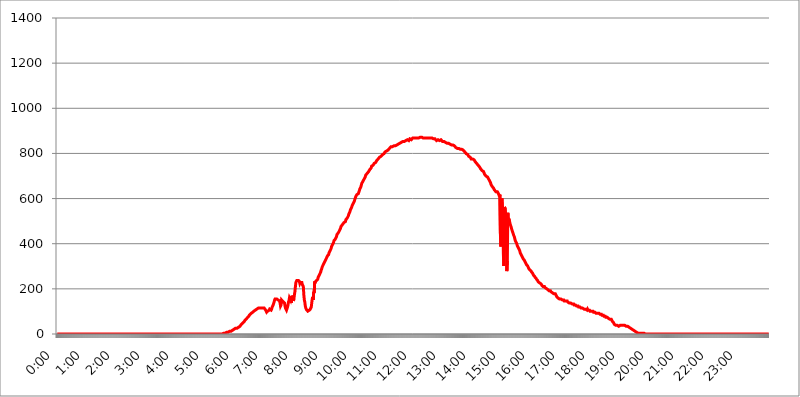
| Category | 2017.08.10. Intenzitás [W/m^2] |
|---|---|
| 0.0 | 0 |
| 0.0006944444444444445 | 0 |
| 0.001388888888888889 | 0 |
| 0.0020833333333333333 | 0 |
| 0.002777777777777778 | 0 |
| 0.003472222222222222 | 0 |
| 0.004166666666666667 | 0 |
| 0.004861111111111111 | 0 |
| 0.005555555555555556 | 0 |
| 0.0062499999999999995 | 0 |
| 0.006944444444444444 | 0 |
| 0.007638888888888889 | 0 |
| 0.008333333333333333 | 0 |
| 0.009027777777777779 | 0 |
| 0.009722222222222222 | 0 |
| 0.010416666666666666 | 0 |
| 0.011111111111111112 | 0 |
| 0.011805555555555555 | 0 |
| 0.012499999999999999 | 0 |
| 0.013194444444444444 | 0 |
| 0.013888888888888888 | 0 |
| 0.014583333333333332 | 0 |
| 0.015277777777777777 | 0 |
| 0.015972222222222224 | 0 |
| 0.016666666666666666 | 0 |
| 0.017361111111111112 | 0 |
| 0.018055555555555557 | 0 |
| 0.01875 | 0 |
| 0.019444444444444445 | 0 |
| 0.02013888888888889 | 0 |
| 0.020833333333333332 | 0 |
| 0.02152777777777778 | 0 |
| 0.022222222222222223 | 0 |
| 0.02291666666666667 | 0 |
| 0.02361111111111111 | 0 |
| 0.024305555555555556 | 0 |
| 0.024999999999999998 | 0 |
| 0.025694444444444447 | 0 |
| 0.02638888888888889 | 0 |
| 0.027083333333333334 | 0 |
| 0.027777777777777776 | 0 |
| 0.02847222222222222 | 0 |
| 0.029166666666666664 | 0 |
| 0.029861111111111113 | 0 |
| 0.030555555555555555 | 0 |
| 0.03125 | 0 |
| 0.03194444444444445 | 0 |
| 0.03263888888888889 | 0 |
| 0.03333333333333333 | 0 |
| 0.034027777777777775 | 0 |
| 0.034722222222222224 | 0 |
| 0.035416666666666666 | 0 |
| 0.036111111111111115 | 0 |
| 0.03680555555555556 | 0 |
| 0.0375 | 0 |
| 0.03819444444444444 | 0 |
| 0.03888888888888889 | 0 |
| 0.03958333333333333 | 0 |
| 0.04027777777777778 | 0 |
| 0.04097222222222222 | 0 |
| 0.041666666666666664 | 0 |
| 0.042361111111111106 | 0 |
| 0.04305555555555556 | 0 |
| 0.043750000000000004 | 0 |
| 0.044444444444444446 | 0 |
| 0.04513888888888889 | 0 |
| 0.04583333333333334 | 0 |
| 0.04652777777777778 | 0 |
| 0.04722222222222222 | 0 |
| 0.04791666666666666 | 0 |
| 0.04861111111111111 | 0 |
| 0.049305555555555554 | 0 |
| 0.049999999999999996 | 0 |
| 0.05069444444444445 | 0 |
| 0.051388888888888894 | 0 |
| 0.052083333333333336 | 0 |
| 0.05277777777777778 | 0 |
| 0.05347222222222222 | 0 |
| 0.05416666666666667 | 0 |
| 0.05486111111111111 | 0 |
| 0.05555555555555555 | 0 |
| 0.05625 | 0 |
| 0.05694444444444444 | 0 |
| 0.057638888888888885 | 0 |
| 0.05833333333333333 | 0 |
| 0.05902777777777778 | 0 |
| 0.059722222222222225 | 0 |
| 0.06041666666666667 | 0 |
| 0.061111111111111116 | 0 |
| 0.06180555555555556 | 0 |
| 0.0625 | 0 |
| 0.06319444444444444 | 0 |
| 0.06388888888888888 | 0 |
| 0.06458333333333334 | 0 |
| 0.06527777777777778 | 0 |
| 0.06597222222222222 | 0 |
| 0.06666666666666667 | 0 |
| 0.06736111111111111 | 0 |
| 0.06805555555555555 | 0 |
| 0.06874999999999999 | 0 |
| 0.06944444444444443 | 0 |
| 0.07013888888888889 | 0 |
| 0.07083333333333333 | 0 |
| 0.07152777777777779 | 0 |
| 0.07222222222222223 | 0 |
| 0.07291666666666667 | 0 |
| 0.07361111111111111 | 0 |
| 0.07430555555555556 | 0 |
| 0.075 | 0 |
| 0.07569444444444444 | 0 |
| 0.0763888888888889 | 0 |
| 0.07708333333333334 | 0 |
| 0.07777777777777778 | 0 |
| 0.07847222222222222 | 0 |
| 0.07916666666666666 | 0 |
| 0.0798611111111111 | 0 |
| 0.08055555555555556 | 0 |
| 0.08125 | 0 |
| 0.08194444444444444 | 0 |
| 0.08263888888888889 | 0 |
| 0.08333333333333333 | 0 |
| 0.08402777777777777 | 0 |
| 0.08472222222222221 | 0 |
| 0.08541666666666665 | 0 |
| 0.08611111111111112 | 0 |
| 0.08680555555555557 | 0 |
| 0.08750000000000001 | 0 |
| 0.08819444444444445 | 0 |
| 0.08888888888888889 | 0 |
| 0.08958333333333333 | 0 |
| 0.09027777777777778 | 0 |
| 0.09097222222222222 | 0 |
| 0.09166666666666667 | 0 |
| 0.09236111111111112 | 0 |
| 0.09305555555555556 | 0 |
| 0.09375 | 0 |
| 0.09444444444444444 | 0 |
| 0.09513888888888888 | 0 |
| 0.09583333333333333 | 0 |
| 0.09652777777777777 | 0 |
| 0.09722222222222222 | 0 |
| 0.09791666666666667 | 0 |
| 0.09861111111111111 | 0 |
| 0.09930555555555555 | 0 |
| 0.09999999999999999 | 0 |
| 0.10069444444444443 | 0 |
| 0.1013888888888889 | 0 |
| 0.10208333333333335 | 0 |
| 0.10277777777777779 | 0 |
| 0.10347222222222223 | 0 |
| 0.10416666666666667 | 0 |
| 0.10486111111111111 | 0 |
| 0.10555555555555556 | 0 |
| 0.10625 | 0 |
| 0.10694444444444444 | 0 |
| 0.1076388888888889 | 0 |
| 0.10833333333333334 | 0 |
| 0.10902777777777778 | 0 |
| 0.10972222222222222 | 0 |
| 0.1111111111111111 | 0 |
| 0.11180555555555556 | 0 |
| 0.11180555555555556 | 0 |
| 0.1125 | 0 |
| 0.11319444444444444 | 0 |
| 0.11388888888888889 | 0 |
| 0.11458333333333333 | 0 |
| 0.11527777777777777 | 0 |
| 0.11597222222222221 | 0 |
| 0.11666666666666665 | 0 |
| 0.1173611111111111 | 0 |
| 0.11805555555555557 | 0 |
| 0.11944444444444445 | 0 |
| 0.12013888888888889 | 0 |
| 0.12083333333333333 | 0 |
| 0.12152777777777778 | 0 |
| 0.12222222222222223 | 0 |
| 0.12291666666666667 | 0 |
| 0.12291666666666667 | 0 |
| 0.12361111111111112 | 0 |
| 0.12430555555555556 | 0 |
| 0.125 | 0 |
| 0.12569444444444444 | 0 |
| 0.12638888888888888 | 0 |
| 0.12708333333333333 | 0 |
| 0.16875 | 0 |
| 0.12847222222222224 | 0 |
| 0.12916666666666668 | 0 |
| 0.12986111111111112 | 0 |
| 0.13055555555555556 | 0 |
| 0.13125 | 0 |
| 0.13194444444444445 | 0 |
| 0.1326388888888889 | 0 |
| 0.13333333333333333 | 0 |
| 0.13402777777777777 | 0 |
| 0.13402777777777777 | 0 |
| 0.13472222222222222 | 0 |
| 0.13541666666666666 | 0 |
| 0.1361111111111111 | 0 |
| 0.13749999999999998 | 0 |
| 0.13819444444444443 | 0 |
| 0.1388888888888889 | 0 |
| 0.13958333333333334 | 0 |
| 0.14027777777777778 | 0 |
| 0.14097222222222222 | 0 |
| 0.14166666666666666 | 0 |
| 0.1423611111111111 | 0 |
| 0.14305555555555557 | 0 |
| 0.14375000000000002 | 0 |
| 0.14444444444444446 | 0 |
| 0.1451388888888889 | 0 |
| 0.1451388888888889 | 0 |
| 0.14652777777777778 | 0 |
| 0.14722222222222223 | 0 |
| 0.14791666666666667 | 0 |
| 0.1486111111111111 | 0 |
| 0.14930555555555555 | 0 |
| 0.15 | 0 |
| 0.15069444444444444 | 0 |
| 0.15138888888888888 | 0 |
| 0.15208333333333332 | 0 |
| 0.15277777777777776 | 0 |
| 0.15347222222222223 | 0 |
| 0.15416666666666667 | 0 |
| 0.15486111111111112 | 0 |
| 0.15555555555555556 | 0 |
| 0.15625 | 0 |
| 0.15694444444444444 | 0 |
| 0.15763888888888888 | 0 |
| 0.15833333333333333 | 0 |
| 0.15902777777777777 | 0 |
| 0.15972222222222224 | 0 |
| 0.16041666666666668 | 0 |
| 0.16111111111111112 | 0 |
| 0.16180555555555556 | 0 |
| 0.1625 | 0 |
| 0.16319444444444445 | 0 |
| 0.1638888888888889 | 0 |
| 0.16458333333333333 | 0 |
| 0.16527777777777777 | 0 |
| 0.16597222222222222 | 0 |
| 0.16666666666666666 | 0 |
| 0.1673611111111111 | 0 |
| 0.16805555555555554 | 0 |
| 0.16874999999999998 | 0 |
| 0.16944444444444443 | 0 |
| 0.17013888888888887 | 0 |
| 0.1708333333333333 | 0 |
| 0.17152777777777775 | 0 |
| 0.17222222222222225 | 0 |
| 0.1729166666666667 | 0 |
| 0.17361111111111113 | 0 |
| 0.17430555555555557 | 0 |
| 0.17500000000000002 | 0 |
| 0.17569444444444446 | 0 |
| 0.1763888888888889 | 0 |
| 0.17708333333333334 | 0 |
| 0.17777777777777778 | 0 |
| 0.17847222222222223 | 0 |
| 0.17916666666666667 | 0 |
| 0.1798611111111111 | 0 |
| 0.18055555555555555 | 0 |
| 0.18125 | 0 |
| 0.18194444444444444 | 0 |
| 0.1826388888888889 | 0 |
| 0.18333333333333335 | 0 |
| 0.1840277777777778 | 0 |
| 0.18472222222222223 | 0 |
| 0.18541666666666667 | 0 |
| 0.18611111111111112 | 0 |
| 0.18680555555555556 | 0 |
| 0.1875 | 0 |
| 0.18819444444444444 | 0 |
| 0.18888888888888888 | 0 |
| 0.18958333333333333 | 0 |
| 0.19027777777777777 | 0 |
| 0.1909722222222222 | 0 |
| 0.19166666666666665 | 0 |
| 0.19236111111111112 | 0 |
| 0.19305555555555554 | 0 |
| 0.19375 | 0 |
| 0.19444444444444445 | 0 |
| 0.1951388888888889 | 0 |
| 0.19583333333333333 | 0 |
| 0.19652777777777777 | 0 |
| 0.19722222222222222 | 0 |
| 0.19791666666666666 | 0 |
| 0.1986111111111111 | 0 |
| 0.19930555555555554 | 0 |
| 0.19999999999999998 | 0 |
| 0.20069444444444443 | 0 |
| 0.20138888888888887 | 0 |
| 0.2020833333333333 | 0 |
| 0.2027777777777778 | 0 |
| 0.2034722222222222 | 0 |
| 0.2041666666666667 | 0 |
| 0.20486111111111113 | 0 |
| 0.20555555555555557 | 0 |
| 0.20625000000000002 | 0 |
| 0.20694444444444446 | 0 |
| 0.2076388888888889 | 0 |
| 0.20833333333333334 | 0 |
| 0.20902777777777778 | 0 |
| 0.20972222222222223 | 0 |
| 0.21041666666666667 | 0 |
| 0.2111111111111111 | 0 |
| 0.21180555555555555 | 0 |
| 0.2125 | 0 |
| 0.21319444444444444 | 0 |
| 0.2138888888888889 | 0 |
| 0.21458333333333335 | 0 |
| 0.2152777777777778 | 0 |
| 0.21597222222222223 | 0 |
| 0.21666666666666667 | 0 |
| 0.21736111111111112 | 0 |
| 0.21805555555555556 | 0 |
| 0.21875 | 0 |
| 0.21944444444444444 | 0 |
| 0.22013888888888888 | 0 |
| 0.22083333333333333 | 0 |
| 0.22152777777777777 | 0 |
| 0.2222222222222222 | 0 |
| 0.22291666666666665 | 0 |
| 0.2236111111111111 | 0 |
| 0.22430555555555556 | 0 |
| 0.225 | 0 |
| 0.22569444444444445 | 0 |
| 0.2263888888888889 | 0 |
| 0.22708333333333333 | 0 |
| 0.22777777777777777 | 0 |
| 0.22847222222222222 | 0 |
| 0.22916666666666666 | 0 |
| 0.2298611111111111 | 0 |
| 0.23055555555555554 | 0 |
| 0.23124999999999998 | 0 |
| 0.23194444444444443 | 3.525 |
| 0.23263888888888887 | 3.525 |
| 0.2333333333333333 | 3.525 |
| 0.2340277777777778 | 3.525 |
| 0.2347222222222222 | 3.525 |
| 0.2354166666666667 | 3.525 |
| 0.23611111111111113 | 3.525 |
| 0.23680555555555557 | 3.525 |
| 0.23750000000000002 | 7.887 |
| 0.23819444444444446 | 7.887 |
| 0.2388888888888889 | 7.887 |
| 0.23958333333333334 | 7.887 |
| 0.24027777777777778 | 7.887 |
| 0.24097222222222223 | 12.257 |
| 0.24166666666666667 | 12.257 |
| 0.2423611111111111 | 12.257 |
| 0.24305555555555555 | 12.257 |
| 0.24375 | 12.257 |
| 0.24444444444444446 | 16.636 |
| 0.24513888888888888 | 16.636 |
| 0.24583333333333335 | 16.636 |
| 0.2465277777777778 | 21.024 |
| 0.24722222222222223 | 21.024 |
| 0.24791666666666667 | 21.024 |
| 0.24861111111111112 | 21.024 |
| 0.24930555555555556 | 21.024 |
| 0.25 | 25.419 |
| 0.25069444444444444 | 25.419 |
| 0.2513888888888889 | 25.419 |
| 0.2520833333333333 | 25.419 |
| 0.25277777777777777 | 29.823 |
| 0.2534722222222222 | 29.823 |
| 0.25416666666666665 | 29.823 |
| 0.2548611111111111 | 34.234 |
| 0.2555555555555556 | 34.234 |
| 0.25625000000000003 | 34.234 |
| 0.2569444444444445 | 38.653 |
| 0.2576388888888889 | 38.653 |
| 0.25833333333333336 | 43.079 |
| 0.2590277777777778 | 43.079 |
| 0.25972222222222224 | 47.511 |
| 0.2604166666666667 | 47.511 |
| 0.2611111111111111 | 51.951 |
| 0.26180555555555557 | 51.951 |
| 0.2625 | 56.398 |
| 0.26319444444444445 | 60.85 |
| 0.2638888888888889 | 60.85 |
| 0.26458333333333334 | 65.31 |
| 0.2652777777777778 | 65.31 |
| 0.2659722222222222 | 69.775 |
| 0.26666666666666666 | 69.775 |
| 0.2673611111111111 | 74.246 |
| 0.26805555555555555 | 74.246 |
| 0.26875 | 78.722 |
| 0.26944444444444443 | 83.205 |
| 0.2701388888888889 | 83.205 |
| 0.2708333333333333 | 87.692 |
| 0.27152777777777776 | 87.692 |
| 0.2722222222222222 | 92.184 |
| 0.27291666666666664 | 92.184 |
| 0.2736111111111111 | 92.184 |
| 0.2743055555555555 | 96.682 |
| 0.27499999999999997 | 96.682 |
| 0.27569444444444446 | 101.184 |
| 0.27638888888888885 | 101.184 |
| 0.27708333333333335 | 101.184 |
| 0.2777777777777778 | 105.69 |
| 0.27847222222222223 | 105.69 |
| 0.2791666666666667 | 105.69 |
| 0.2798611111111111 | 110.201 |
| 0.28055555555555556 | 110.201 |
| 0.28125 | 110.201 |
| 0.28194444444444444 | 114.716 |
| 0.2826388888888889 | 114.716 |
| 0.2833333333333333 | 114.716 |
| 0.28402777777777777 | 114.716 |
| 0.2847222222222222 | 114.716 |
| 0.28541666666666665 | 114.716 |
| 0.28611111111111115 | 114.716 |
| 0.28680555555555554 | 114.716 |
| 0.28750000000000003 | 114.716 |
| 0.2881944444444445 | 114.716 |
| 0.2888888888888889 | 114.716 |
| 0.28958333333333336 | 114.716 |
| 0.2902777777777778 | 114.716 |
| 0.29097222222222224 | 114.716 |
| 0.2916666666666667 | 114.716 |
| 0.2923611111111111 | 105.69 |
| 0.29305555555555557 | 101.184 |
| 0.29375 | 96.682 |
| 0.29444444444444445 | 96.682 |
| 0.2951388888888889 | 101.184 |
| 0.29583333333333334 | 101.184 |
| 0.2965277777777778 | 101.184 |
| 0.2972222222222222 | 105.69 |
| 0.29791666666666666 | 110.201 |
| 0.2986111111111111 | 110.201 |
| 0.29930555555555555 | 110.201 |
| 0.3 | 105.69 |
| 0.30069444444444443 | 110.201 |
| 0.3013888888888889 | 119.235 |
| 0.3020833333333333 | 119.235 |
| 0.30277777777777776 | 128.284 |
| 0.3034722222222222 | 128.284 |
| 0.30416666666666664 | 141.884 |
| 0.3048611111111111 | 150.964 |
| 0.3055555555555555 | 155.509 |
| 0.30624999999999997 | 155.509 |
| 0.3069444444444444 | 155.509 |
| 0.3076388888888889 | 155.509 |
| 0.30833333333333335 | 155.509 |
| 0.3090277777777778 | 155.509 |
| 0.30972222222222223 | 150.964 |
| 0.3104166666666667 | 150.964 |
| 0.3111111111111111 | 150.964 |
| 0.31180555555555556 | 146.423 |
| 0.3125 | 137.347 |
| 0.31319444444444444 | 123.758 |
| 0.3138888888888889 | 128.284 |
| 0.3145833333333333 | 150.964 |
| 0.31527777777777777 | 150.964 |
| 0.3159722222222222 | 146.423 |
| 0.31666666666666665 | 146.423 |
| 0.31736111111111115 | 141.884 |
| 0.31805555555555554 | 141.884 |
| 0.31875000000000003 | 137.347 |
| 0.3194444444444445 | 123.758 |
| 0.3201388888888889 | 114.716 |
| 0.32083333333333336 | 110.201 |
| 0.3215277777777778 | 105.69 |
| 0.32222222222222224 | 105.69 |
| 0.3229166666666667 | 119.235 |
| 0.3236111111111111 | 128.284 |
| 0.32430555555555557 | 141.884 |
| 0.325 | 146.423 |
| 0.32569444444444445 | 160.056 |
| 0.3263888888888889 | 155.509 |
| 0.32708333333333334 | 150.964 |
| 0.3277777777777778 | 164.605 |
| 0.3284722222222222 | 137.347 |
| 0.32916666666666666 | 169.156 |
| 0.3298611111111111 | 155.509 |
| 0.33055555555555555 | 169.156 |
| 0.33125 | 146.423 |
| 0.33194444444444443 | 155.509 |
| 0.3326388888888889 | 173.709 |
| 0.3333333333333333 | 187.378 |
| 0.3340277777777778 | 210.182 |
| 0.3347222222222222 | 228.436 |
| 0.3354166666666667 | 228.436 |
| 0.3361111111111111 | 237.564 |
| 0.3368055555555556 | 237.564 |
| 0.33749999999999997 | 237.564 |
| 0.33819444444444446 | 237.564 |
| 0.33888888888888885 | 237.564 |
| 0.33958333333333335 | 233 |
| 0.34027777777777773 | 223.873 |
| 0.34097222222222223 | 228.436 |
| 0.3416666666666666 | 228.436 |
| 0.3423611111111111 | 228.436 |
| 0.3430555555555555 | 228.436 |
| 0.34375 | 219.309 |
| 0.3444444444444445 | 214.746 |
| 0.3451388888888889 | 210.182 |
| 0.3458333333333334 | 173.709 |
| 0.34652777777777777 | 150.964 |
| 0.34722222222222227 | 141.884 |
| 0.34791666666666665 | 123.758 |
| 0.34861111111111115 | 114.716 |
| 0.34930555555555554 | 110.201 |
| 0.35000000000000003 | 105.69 |
| 0.3506944444444444 | 105.69 |
| 0.3513888888888889 | 101.184 |
| 0.3520833333333333 | 101.184 |
| 0.3527777777777778 | 101.184 |
| 0.3534722222222222 | 105.69 |
| 0.3541666666666667 | 105.69 |
| 0.3548611111111111 | 110.201 |
| 0.35555555555555557 | 114.716 |
| 0.35625 | 119.235 |
| 0.35694444444444445 | 119.235 |
| 0.3576388888888889 | 155.509 |
| 0.35833333333333334 | 164.605 |
| 0.3590277777777778 | 150.964 |
| 0.3597222222222222 | 187.378 |
| 0.36041666666666666 | 182.82 |
| 0.3611111111111111 | 233 |
| 0.36180555555555555 | 228.436 |
| 0.3625 | 233 |
| 0.36319444444444443 | 233 |
| 0.3638888888888889 | 237.564 |
| 0.3645833333333333 | 237.564 |
| 0.3652777777777778 | 242.127 |
| 0.3659722222222222 | 251.251 |
| 0.3666666666666667 | 255.813 |
| 0.3673611111111111 | 260.373 |
| 0.3680555555555556 | 264.932 |
| 0.36874999999999997 | 269.49 |
| 0.36944444444444446 | 274.047 |
| 0.37013888888888885 | 283.156 |
| 0.37083333333333335 | 287.709 |
| 0.37152777777777773 | 296.808 |
| 0.37222222222222223 | 301.354 |
| 0.3729166666666666 | 305.898 |
| 0.3736111111111111 | 305.898 |
| 0.3743055555555555 | 314.98 |
| 0.375 | 319.517 |
| 0.3756944444444445 | 324.052 |
| 0.3763888888888889 | 328.584 |
| 0.3770833333333334 | 333.113 |
| 0.37777777777777777 | 337.639 |
| 0.37847222222222227 | 342.162 |
| 0.37916666666666665 | 346.682 |
| 0.37986111111111115 | 346.682 |
| 0.38055555555555554 | 351.198 |
| 0.38125000000000003 | 360.221 |
| 0.3819444444444444 | 360.221 |
| 0.3826388888888889 | 369.23 |
| 0.3833333333333333 | 373.729 |
| 0.3840277777777778 | 378.224 |
| 0.3847222222222222 | 387.202 |
| 0.3854166666666667 | 387.202 |
| 0.3861111111111111 | 396.164 |
| 0.38680555555555557 | 400.638 |
| 0.3875 | 405.108 |
| 0.38819444444444445 | 414.035 |
| 0.3888888888888889 | 414.035 |
| 0.38958333333333334 | 418.492 |
| 0.3902777777777778 | 422.943 |
| 0.3909722222222222 | 427.39 |
| 0.39166666666666666 | 431.833 |
| 0.3923611111111111 | 440.702 |
| 0.39305555555555555 | 445.129 |
| 0.39375 | 445.129 |
| 0.39444444444444443 | 449.551 |
| 0.3951388888888889 | 453.968 |
| 0.3958333333333333 | 458.38 |
| 0.3965277777777778 | 462.786 |
| 0.3972222222222222 | 467.187 |
| 0.3979166666666667 | 475.972 |
| 0.3986111111111111 | 475.972 |
| 0.3993055555555556 | 480.356 |
| 0.39999999999999997 | 484.735 |
| 0.40069444444444446 | 489.108 |
| 0.40138888888888885 | 489.108 |
| 0.40208333333333335 | 493.475 |
| 0.40277777777777773 | 493.475 |
| 0.40347222222222223 | 497.836 |
| 0.4041666666666666 | 497.836 |
| 0.4048611111111111 | 506.542 |
| 0.4055555555555555 | 506.542 |
| 0.40625 | 510.885 |
| 0.4069444444444445 | 515.223 |
| 0.4076388888888889 | 519.555 |
| 0.4083333333333334 | 523.88 |
| 0.40902777777777777 | 532.513 |
| 0.40972222222222227 | 536.82 |
| 0.41041666666666665 | 541.121 |
| 0.41111111111111115 | 549.704 |
| 0.41180555555555554 | 553.986 |
| 0.41250000000000003 | 558.261 |
| 0.4131944444444444 | 562.53 |
| 0.4138888888888889 | 571.049 |
| 0.4145833333333333 | 575.299 |
| 0.4152777777777778 | 579.542 |
| 0.4159722222222222 | 583.779 |
| 0.4166666666666667 | 588.009 |
| 0.4173611111111111 | 596.45 |
| 0.41805555555555557 | 600.661 |
| 0.41875 | 609.062 |
| 0.41944444444444445 | 613.252 |
| 0.4201388888888889 | 617.436 |
| 0.42083333333333334 | 621.613 |
| 0.4215277777777778 | 621.613 |
| 0.4222222222222222 | 621.613 |
| 0.42291666666666666 | 625.784 |
| 0.4236111111111111 | 634.105 |
| 0.42430555555555555 | 642.4 |
| 0.425 | 646.537 |
| 0.42569444444444443 | 650.667 |
| 0.4263888888888889 | 658.909 |
| 0.4270833333333333 | 667.123 |
| 0.4277777777777778 | 667.123 |
| 0.4284722222222222 | 671.22 |
| 0.4291666666666667 | 679.395 |
| 0.4298611111111111 | 683.473 |
| 0.4305555555555556 | 687.544 |
| 0.43124999999999997 | 691.608 |
| 0.43194444444444446 | 695.666 |
| 0.43263888888888885 | 703.762 |
| 0.43333333333333335 | 703.762 |
| 0.43402777777777773 | 707.8 |
| 0.43472222222222223 | 711.832 |
| 0.4354166666666666 | 711.832 |
| 0.4361111111111111 | 711.832 |
| 0.4368055555555555 | 719.877 |
| 0.4375 | 723.889 |
| 0.4381944444444445 | 727.896 |
| 0.4388888888888889 | 727.896 |
| 0.4395833333333334 | 727.896 |
| 0.44027777777777777 | 735.89 |
| 0.44097222222222227 | 743.859 |
| 0.44166666666666665 | 743.859 |
| 0.44236111111111115 | 747.834 |
| 0.44305555555555554 | 747.834 |
| 0.44375000000000003 | 751.803 |
| 0.4444444444444444 | 755.766 |
| 0.4451388888888889 | 759.723 |
| 0.4458333333333333 | 755.766 |
| 0.4465277777777778 | 759.723 |
| 0.4472222222222222 | 763.674 |
| 0.4479166666666667 | 767.62 |
| 0.4486111111111111 | 771.559 |
| 0.44930555555555557 | 771.559 |
| 0.45 | 775.492 |
| 0.45069444444444445 | 775.492 |
| 0.4513888888888889 | 779.42 |
| 0.45208333333333334 | 783.342 |
| 0.4527777777777778 | 783.342 |
| 0.4534722222222222 | 787.258 |
| 0.45416666666666666 | 787.258 |
| 0.4548611111111111 | 791.169 |
| 0.45555555555555555 | 791.169 |
| 0.45625 | 795.074 |
| 0.45694444444444443 | 798.974 |
| 0.4576388888888889 | 798.974 |
| 0.4583333333333333 | 798.974 |
| 0.4590277777777778 | 802.868 |
| 0.4597222222222222 | 806.757 |
| 0.4604166666666667 | 810.641 |
| 0.4611111111111111 | 806.757 |
| 0.4618055555555556 | 810.641 |
| 0.46249999999999997 | 810.641 |
| 0.46319444444444446 | 810.641 |
| 0.46388888888888885 | 814.519 |
| 0.46458333333333335 | 814.519 |
| 0.46527777777777773 | 818.392 |
| 0.46597222222222223 | 822.26 |
| 0.4666666666666666 | 822.26 |
| 0.4673611111111111 | 826.123 |
| 0.4680555555555555 | 829.981 |
| 0.46875 | 829.981 |
| 0.4694444444444445 | 833.834 |
| 0.4701388888888889 | 829.981 |
| 0.4708333333333334 | 829.981 |
| 0.47152777777777777 | 833.834 |
| 0.47222222222222227 | 833.834 |
| 0.47291666666666665 | 833.834 |
| 0.47361111111111115 | 833.834 |
| 0.47430555555555554 | 833.834 |
| 0.47500000000000003 | 837.682 |
| 0.4756944444444444 | 833.834 |
| 0.4763888888888889 | 837.682 |
| 0.4770833333333333 | 841.526 |
| 0.4777777777777778 | 841.526 |
| 0.4784722222222222 | 841.526 |
| 0.4791666666666667 | 845.365 |
| 0.4798611111111111 | 841.526 |
| 0.48055555555555557 | 845.365 |
| 0.48125 | 845.365 |
| 0.48194444444444445 | 849.199 |
| 0.4826388888888889 | 849.199 |
| 0.48333333333333334 | 853.029 |
| 0.4840277777777778 | 853.029 |
| 0.4847222222222222 | 853.029 |
| 0.48541666666666666 | 853.029 |
| 0.4861111111111111 | 853.029 |
| 0.48680555555555555 | 853.029 |
| 0.4875 | 853.029 |
| 0.48819444444444443 | 856.855 |
| 0.4888888888888889 | 856.855 |
| 0.4895833333333333 | 856.855 |
| 0.4902777777777778 | 860.676 |
| 0.4909722222222222 | 860.676 |
| 0.4916666666666667 | 860.676 |
| 0.4923611111111111 | 856.855 |
| 0.4930555555555556 | 856.855 |
| 0.49374999999999997 | 860.676 |
| 0.49444444444444446 | 864.493 |
| 0.49513888888888885 | 864.493 |
| 0.49583333333333335 | 860.676 |
| 0.49652777777777773 | 860.676 |
| 0.49722222222222223 | 864.493 |
| 0.4979166666666666 | 864.493 |
| 0.4986111111111111 | 868.305 |
| 0.4993055555555555 | 868.305 |
| 0.5 | 868.305 |
| 0.5006944444444444 | 868.305 |
| 0.5013888888888889 | 868.305 |
| 0.5020833333333333 | 868.305 |
| 0.5027777777777778 | 868.305 |
| 0.5034722222222222 | 864.493 |
| 0.5041666666666667 | 868.305 |
| 0.5048611111111111 | 868.305 |
| 0.5055555555555555 | 868.305 |
| 0.50625 | 868.305 |
| 0.5069444444444444 | 868.305 |
| 0.5076388888888889 | 868.305 |
| 0.5083333333333333 | 868.305 |
| 0.5090277777777777 | 872.114 |
| 0.5097222222222222 | 872.114 |
| 0.5104166666666666 | 868.305 |
| 0.5111111111111112 | 872.114 |
| 0.5118055555555555 | 868.305 |
| 0.5125000000000001 | 868.305 |
| 0.5131944444444444 | 868.305 |
| 0.513888888888889 | 868.305 |
| 0.5145833333333333 | 864.493 |
| 0.5152777777777778 | 868.305 |
| 0.5159722222222222 | 868.305 |
| 0.5166666666666667 | 868.305 |
| 0.517361111111111 | 868.305 |
| 0.5180555555555556 | 868.305 |
| 0.5187499999999999 | 864.493 |
| 0.5194444444444445 | 868.305 |
| 0.5201388888888888 | 868.305 |
| 0.5208333333333334 | 868.305 |
| 0.5215277777777778 | 868.305 |
| 0.5222222222222223 | 868.305 |
| 0.5229166666666667 | 868.305 |
| 0.5236111111111111 | 868.305 |
| 0.5243055555555556 | 868.305 |
| 0.525 | 868.305 |
| 0.5256944444444445 | 868.305 |
| 0.5263888888888889 | 868.305 |
| 0.5270833333333333 | 868.305 |
| 0.5277777777777778 | 864.493 |
| 0.5284722222222222 | 868.305 |
| 0.5291666666666667 | 868.305 |
| 0.5298611111111111 | 864.493 |
| 0.5305555555555556 | 860.676 |
| 0.53125 | 860.676 |
| 0.5319444444444444 | 856.855 |
| 0.5326388888888889 | 860.676 |
| 0.5333333333333333 | 860.676 |
| 0.5340277777777778 | 860.676 |
| 0.5347222222222222 | 860.676 |
| 0.5354166666666667 | 856.855 |
| 0.5361111111111111 | 856.855 |
| 0.5368055555555555 | 860.676 |
| 0.5375 | 860.676 |
| 0.5381944444444444 | 860.676 |
| 0.5388888888888889 | 856.855 |
| 0.5395833333333333 | 856.855 |
| 0.5402777777777777 | 853.029 |
| 0.5409722222222222 | 853.029 |
| 0.5416666666666666 | 853.029 |
| 0.5423611111111112 | 853.029 |
| 0.5430555555555555 | 853.029 |
| 0.5437500000000001 | 849.199 |
| 0.5444444444444444 | 849.199 |
| 0.545138888888889 | 845.365 |
| 0.5458333333333333 | 845.365 |
| 0.5465277777777778 | 845.365 |
| 0.5472222222222222 | 845.365 |
| 0.5479166666666667 | 845.365 |
| 0.548611111111111 | 845.365 |
| 0.5493055555555556 | 841.526 |
| 0.5499999999999999 | 841.526 |
| 0.5506944444444445 | 841.526 |
| 0.5513888888888888 | 837.682 |
| 0.5520833333333334 | 837.682 |
| 0.5527777777777778 | 837.682 |
| 0.5534722222222223 | 837.682 |
| 0.5541666666666667 | 837.682 |
| 0.5548611111111111 | 837.682 |
| 0.5555555555555556 | 833.834 |
| 0.55625 | 833.834 |
| 0.5569444444444445 | 833.834 |
| 0.5576388888888889 | 829.981 |
| 0.5583333333333333 | 833.834 |
| 0.5590277777777778 | 826.123 |
| 0.5597222222222222 | 826.123 |
| 0.5604166666666667 | 826.123 |
| 0.5611111111111111 | 822.26 |
| 0.5618055555555556 | 822.26 |
| 0.5625 | 822.26 |
| 0.5631944444444444 | 822.26 |
| 0.5638888888888889 | 822.26 |
| 0.5645833333333333 | 818.392 |
| 0.5652777777777778 | 818.392 |
| 0.5659722222222222 | 818.392 |
| 0.5666666666666667 | 818.392 |
| 0.5673611111111111 | 818.392 |
| 0.5680555555555555 | 818.392 |
| 0.56875 | 818.392 |
| 0.5694444444444444 | 814.519 |
| 0.5701388888888889 | 814.519 |
| 0.5708333333333333 | 810.641 |
| 0.5715277777777777 | 806.757 |
| 0.5722222222222222 | 802.868 |
| 0.5729166666666666 | 802.868 |
| 0.5736111111111112 | 798.974 |
| 0.5743055555555555 | 798.974 |
| 0.5750000000000001 | 798.974 |
| 0.5756944444444444 | 795.074 |
| 0.576388888888889 | 791.169 |
| 0.5770833333333333 | 787.258 |
| 0.5777777777777778 | 791.169 |
| 0.5784722222222222 | 787.258 |
| 0.5791666666666667 | 783.342 |
| 0.579861111111111 | 779.42 |
| 0.5805555555555556 | 775.492 |
| 0.5812499999999999 | 779.42 |
| 0.5819444444444445 | 775.492 |
| 0.5826388888888888 | 775.492 |
| 0.5833333333333334 | 775.492 |
| 0.5840277777777778 | 771.559 |
| 0.5847222222222223 | 771.559 |
| 0.5854166666666667 | 767.62 |
| 0.5861111111111111 | 763.674 |
| 0.5868055555555556 | 763.674 |
| 0.5875 | 759.723 |
| 0.5881944444444445 | 755.766 |
| 0.5888888888888889 | 751.803 |
| 0.5895833333333333 | 751.803 |
| 0.5902777777777778 | 747.834 |
| 0.5909722222222222 | 743.859 |
| 0.5916666666666667 | 743.859 |
| 0.5923611111111111 | 739.877 |
| 0.5930555555555556 | 735.89 |
| 0.59375 | 731.896 |
| 0.5944444444444444 | 731.896 |
| 0.5951388888888889 | 727.896 |
| 0.5958333333333333 | 723.889 |
| 0.5965277777777778 | 723.889 |
| 0.5972222222222222 | 719.877 |
| 0.5979166666666667 | 719.877 |
| 0.5986111111111111 | 715.858 |
| 0.5993055555555555 | 707.8 |
| 0.6 | 707.8 |
| 0.6006944444444444 | 703.762 |
| 0.6013888888888889 | 699.717 |
| 0.6020833333333333 | 699.717 |
| 0.6027777777777777 | 695.666 |
| 0.6034722222222222 | 695.666 |
| 0.6041666666666666 | 691.608 |
| 0.6048611111111112 | 687.544 |
| 0.6055555555555555 | 683.473 |
| 0.6062500000000001 | 679.395 |
| 0.6069444444444444 | 675.311 |
| 0.607638888888889 | 671.22 |
| 0.6083333333333333 | 663.019 |
| 0.6090277777777778 | 658.909 |
| 0.6097222222222222 | 654.791 |
| 0.6104166666666667 | 650.667 |
| 0.611111111111111 | 650.667 |
| 0.6118055555555556 | 646.537 |
| 0.6124999999999999 | 642.4 |
| 0.6131944444444445 | 638.256 |
| 0.6138888888888888 | 638.256 |
| 0.6145833333333334 | 634.105 |
| 0.6152777777777778 | 629.948 |
| 0.6159722222222223 | 629.948 |
| 0.6166666666666667 | 629.948 |
| 0.6173611111111111 | 629.948 |
| 0.6180555555555556 | 625.784 |
| 0.61875 | 625.784 |
| 0.6194444444444445 | 617.436 |
| 0.6201388888888889 | 609.062 |
| 0.6208333333333333 | 617.436 |
| 0.6215277777777778 | 445.129 |
| 0.6222222222222222 | 387.202 |
| 0.6229166666666667 | 566.793 |
| 0.6236111111111111 | 600.661 |
| 0.6243055555555556 | 596.45 |
| 0.625 | 532.513 |
| 0.6256944444444444 | 355.712 |
| 0.6263888888888889 | 301.354 |
| 0.6270833333333333 | 562.53 |
| 0.6277777777777778 | 562.53 |
| 0.6284722222222222 | 553.986 |
| 0.6291666666666667 | 558.261 |
| 0.6298611111111111 | 449.551 |
| 0.6305555555555555 | 278.603 |
| 0.63125 | 324.052 |
| 0.6319444444444444 | 536.82 |
| 0.6326388888888889 | 502.192 |
| 0.6333333333333333 | 510.885 |
| 0.6340277777777777 | 506.542 |
| 0.6347222222222222 | 493.475 |
| 0.6354166666666666 | 484.735 |
| 0.6361111111111112 | 480.356 |
| 0.6368055555555555 | 471.582 |
| 0.6375000000000001 | 462.786 |
| 0.6381944444444444 | 458.38 |
| 0.638888888888889 | 449.551 |
| 0.6395833333333333 | 445.129 |
| 0.6402777777777778 | 436.27 |
| 0.6409722222222222 | 431.833 |
| 0.6416666666666667 | 422.943 |
| 0.642361111111111 | 414.035 |
| 0.6430555555555556 | 409.574 |
| 0.6437499999999999 | 405.108 |
| 0.6444444444444445 | 400.638 |
| 0.6451388888888888 | 391.685 |
| 0.6458333333333334 | 387.202 |
| 0.6465277777777778 | 382.715 |
| 0.6472222222222223 | 378.224 |
| 0.6479166666666667 | 373.729 |
| 0.6486111111111111 | 369.23 |
| 0.6493055555555556 | 360.221 |
| 0.65 | 360.221 |
| 0.6506944444444445 | 351.198 |
| 0.6513888888888889 | 346.682 |
| 0.6520833333333333 | 342.162 |
| 0.6527777777777778 | 337.639 |
| 0.6534722222222222 | 333.113 |
| 0.6541666666666667 | 333.113 |
| 0.6548611111111111 | 328.584 |
| 0.6555555555555556 | 324.052 |
| 0.65625 | 319.517 |
| 0.6569444444444444 | 314.98 |
| 0.6576388888888889 | 310.44 |
| 0.6583333333333333 | 305.898 |
| 0.6590277777777778 | 305.898 |
| 0.6597222222222222 | 301.354 |
| 0.6604166666666667 | 296.808 |
| 0.6611111111111111 | 296.808 |
| 0.6618055555555555 | 287.709 |
| 0.6625 | 287.709 |
| 0.6631944444444444 | 283.156 |
| 0.6638888888888889 | 283.156 |
| 0.6645833333333333 | 278.603 |
| 0.6652777777777777 | 274.047 |
| 0.6659722222222222 | 274.047 |
| 0.6666666666666666 | 269.49 |
| 0.6673611111111111 | 264.932 |
| 0.6680555555555556 | 260.373 |
| 0.6687500000000001 | 260.373 |
| 0.6694444444444444 | 255.813 |
| 0.6701388888888888 | 251.251 |
| 0.6708333333333334 | 251.251 |
| 0.6715277777777778 | 246.689 |
| 0.6722222222222222 | 242.127 |
| 0.6729166666666666 | 242.127 |
| 0.6736111111111112 | 237.564 |
| 0.6743055555555556 | 233 |
| 0.6749999999999999 | 233 |
| 0.6756944444444444 | 228.436 |
| 0.6763888888888889 | 228.436 |
| 0.6770833333333334 | 228.436 |
| 0.6777777777777777 | 223.873 |
| 0.6784722222222223 | 223.873 |
| 0.6791666666666667 | 219.309 |
| 0.6798611111111111 | 214.746 |
| 0.6805555555555555 | 214.746 |
| 0.68125 | 210.182 |
| 0.6819444444444445 | 210.182 |
| 0.6826388888888889 | 210.182 |
| 0.6833333333333332 | 210.182 |
| 0.6840277777777778 | 205.62 |
| 0.6847222222222222 | 205.62 |
| 0.6854166666666667 | 205.62 |
| 0.686111111111111 | 201.058 |
| 0.6868055555555556 | 201.058 |
| 0.6875 | 201.058 |
| 0.6881944444444444 | 196.497 |
| 0.688888888888889 | 196.497 |
| 0.6895833333333333 | 191.937 |
| 0.6902777777777778 | 191.937 |
| 0.6909722222222222 | 191.937 |
| 0.6916666666666668 | 191.937 |
| 0.6923611111111111 | 187.378 |
| 0.6930555555555555 | 187.378 |
| 0.69375 | 187.378 |
| 0.6944444444444445 | 182.82 |
| 0.6951388888888889 | 182.82 |
| 0.6958333333333333 | 182.82 |
| 0.6965277777777777 | 178.264 |
| 0.6972222222222223 | 178.264 |
| 0.6979166666666666 | 178.264 |
| 0.6986111111111111 | 178.264 |
| 0.6993055555555556 | 173.709 |
| 0.7000000000000001 | 169.156 |
| 0.7006944444444444 | 164.605 |
| 0.7013888888888888 | 164.605 |
| 0.7020833333333334 | 160.056 |
| 0.7027777777777778 | 160.056 |
| 0.7034722222222222 | 160.056 |
| 0.7041666666666666 | 155.509 |
| 0.7048611111111112 | 155.509 |
| 0.7055555555555556 | 155.509 |
| 0.7062499999999999 | 155.509 |
| 0.7069444444444444 | 155.509 |
| 0.7076388888888889 | 155.509 |
| 0.7083333333333334 | 150.964 |
| 0.7090277777777777 | 150.964 |
| 0.7097222222222223 | 150.964 |
| 0.7104166666666667 | 150.964 |
| 0.7111111111111111 | 146.423 |
| 0.7118055555555555 | 146.423 |
| 0.7125 | 146.423 |
| 0.7131944444444445 | 146.423 |
| 0.7138888888888889 | 146.423 |
| 0.7145833333333332 | 146.423 |
| 0.7152777777777778 | 146.423 |
| 0.7159722222222222 | 141.884 |
| 0.7166666666666667 | 141.884 |
| 0.717361111111111 | 141.884 |
| 0.7180555555555556 | 137.347 |
| 0.71875 | 137.347 |
| 0.7194444444444444 | 137.347 |
| 0.720138888888889 | 137.347 |
| 0.7208333333333333 | 137.347 |
| 0.7215277777777778 | 137.347 |
| 0.7222222222222222 | 132.814 |
| 0.7229166666666668 | 132.814 |
| 0.7236111111111111 | 132.814 |
| 0.7243055555555555 | 132.814 |
| 0.725 | 128.284 |
| 0.7256944444444445 | 128.284 |
| 0.7263888888888889 | 128.284 |
| 0.7270833333333333 | 128.284 |
| 0.7277777777777777 | 128.284 |
| 0.7284722222222223 | 123.758 |
| 0.7291666666666666 | 123.758 |
| 0.7298611111111111 | 123.758 |
| 0.7305555555555556 | 123.758 |
| 0.7312500000000001 | 119.235 |
| 0.7319444444444444 | 119.235 |
| 0.7326388888888888 | 119.235 |
| 0.7333333333333334 | 119.235 |
| 0.7340277777777778 | 119.235 |
| 0.7347222222222222 | 114.716 |
| 0.7354166666666666 | 114.716 |
| 0.7361111111111112 | 114.716 |
| 0.7368055555555556 | 114.716 |
| 0.7374999999999999 | 114.716 |
| 0.7381944444444444 | 114.716 |
| 0.7388888888888889 | 110.201 |
| 0.7395833333333334 | 110.201 |
| 0.7402777777777777 | 110.201 |
| 0.7409722222222223 | 110.201 |
| 0.7416666666666667 | 110.201 |
| 0.7423611111111111 | 110.201 |
| 0.7430555555555555 | 105.69 |
| 0.74375 | 110.201 |
| 0.7444444444444445 | 105.69 |
| 0.7451388888888889 | 105.69 |
| 0.7458333333333332 | 105.69 |
| 0.7465277777777778 | 105.69 |
| 0.7472222222222222 | 101.184 |
| 0.7479166666666667 | 101.184 |
| 0.748611111111111 | 101.184 |
| 0.7493055555555556 | 101.184 |
| 0.75 | 101.184 |
| 0.7506944444444444 | 101.184 |
| 0.751388888888889 | 101.184 |
| 0.7520833333333333 | 96.682 |
| 0.7527777777777778 | 96.682 |
| 0.7534722222222222 | 96.682 |
| 0.7541666666666668 | 96.682 |
| 0.7548611111111111 | 96.682 |
| 0.7555555555555555 | 92.184 |
| 0.75625 | 92.184 |
| 0.7569444444444445 | 92.184 |
| 0.7576388888888889 | 92.184 |
| 0.7583333333333333 | 92.184 |
| 0.7590277777777777 | 92.184 |
| 0.7597222222222223 | 92.184 |
| 0.7604166666666666 | 92.184 |
| 0.7611111111111111 | 87.692 |
| 0.7618055555555556 | 87.692 |
| 0.7625000000000001 | 87.692 |
| 0.7631944444444444 | 87.692 |
| 0.7638888888888888 | 83.205 |
| 0.7645833333333334 | 83.205 |
| 0.7652777777777778 | 83.205 |
| 0.7659722222222222 | 83.205 |
| 0.7666666666666666 | 78.722 |
| 0.7673611111111112 | 78.722 |
| 0.7680555555555556 | 78.722 |
| 0.7687499999999999 | 78.722 |
| 0.7694444444444444 | 74.246 |
| 0.7701388888888889 | 74.246 |
| 0.7708333333333334 | 74.246 |
| 0.7715277777777777 | 74.246 |
| 0.7722222222222223 | 74.246 |
| 0.7729166666666667 | 69.775 |
| 0.7736111111111111 | 69.775 |
| 0.7743055555555555 | 69.775 |
| 0.775 | 65.31 |
| 0.7756944444444445 | 65.31 |
| 0.7763888888888889 | 65.31 |
| 0.7770833333333332 | 65.31 |
| 0.7777777777777778 | 60.85 |
| 0.7784722222222222 | 56.398 |
| 0.7791666666666667 | 56.398 |
| 0.779861111111111 | 51.951 |
| 0.7805555555555556 | 47.511 |
| 0.78125 | 43.079 |
| 0.7819444444444444 | 43.079 |
| 0.782638888888889 | 43.079 |
| 0.7833333333333333 | 38.653 |
| 0.7840277777777778 | 38.653 |
| 0.7847222222222222 | 38.653 |
| 0.7854166666666668 | 38.653 |
| 0.7861111111111111 | 38.653 |
| 0.7868055555555555 | 34.234 |
| 0.7875 | 34.234 |
| 0.7881944444444445 | 38.653 |
| 0.7888888888888889 | 38.653 |
| 0.7895833333333333 | 38.653 |
| 0.7902777777777777 | 38.653 |
| 0.7909722222222223 | 38.653 |
| 0.7916666666666666 | 38.653 |
| 0.7923611111111111 | 38.653 |
| 0.7930555555555556 | 38.653 |
| 0.7937500000000001 | 38.653 |
| 0.7944444444444444 | 38.653 |
| 0.7951388888888888 | 38.653 |
| 0.7958333333333334 | 38.653 |
| 0.7965277777777778 | 38.653 |
| 0.7972222222222222 | 34.234 |
| 0.7979166666666666 | 34.234 |
| 0.7986111111111112 | 34.234 |
| 0.7993055555555556 | 34.234 |
| 0.7999999999999999 | 34.234 |
| 0.8006944444444444 | 29.823 |
| 0.8013888888888889 | 29.823 |
| 0.8020833333333334 | 29.823 |
| 0.8027777777777777 | 25.419 |
| 0.8034722222222223 | 25.419 |
| 0.8041666666666667 | 25.419 |
| 0.8048611111111111 | 21.024 |
| 0.8055555555555555 | 21.024 |
| 0.80625 | 21.024 |
| 0.8069444444444445 | 16.636 |
| 0.8076388888888889 | 16.636 |
| 0.8083333333333332 | 16.636 |
| 0.8090277777777778 | 12.257 |
| 0.8097222222222222 | 12.257 |
| 0.8104166666666667 | 12.257 |
| 0.811111111111111 | 12.257 |
| 0.8118055555555556 | 12.257 |
| 0.8125 | 7.887 |
| 0.8131944444444444 | 7.887 |
| 0.813888888888889 | 7.887 |
| 0.8145833333333333 | 3.525 |
| 0.8152777777777778 | 3.525 |
| 0.8159722222222222 | 3.525 |
| 0.8166666666666668 | 3.525 |
| 0.8173611111111111 | 3.525 |
| 0.8180555555555555 | 3.525 |
| 0.81875 | 3.525 |
| 0.8194444444444445 | 3.525 |
| 0.8201388888888889 | 3.525 |
| 0.8208333333333333 | 3.525 |
| 0.8215277777777777 | 3.525 |
| 0.8222222222222223 | 3.525 |
| 0.8229166666666666 | 3.525 |
| 0.8236111111111111 | 0 |
| 0.8243055555555556 | 0 |
| 0.8250000000000001 | 0 |
| 0.8256944444444444 | 0 |
| 0.8263888888888888 | 0 |
| 0.8270833333333334 | 0 |
| 0.8277777777777778 | 0 |
| 0.8284722222222222 | 0 |
| 0.8291666666666666 | 0 |
| 0.8298611111111112 | 0 |
| 0.8305555555555556 | 0 |
| 0.8312499999999999 | 0 |
| 0.8319444444444444 | 0 |
| 0.8326388888888889 | 0 |
| 0.8333333333333334 | 0 |
| 0.8340277777777777 | 0 |
| 0.8347222222222223 | 0 |
| 0.8354166666666667 | 0 |
| 0.8361111111111111 | 0 |
| 0.8368055555555555 | 0 |
| 0.8375 | 0 |
| 0.8381944444444445 | 0 |
| 0.8388888888888889 | 0 |
| 0.8395833333333332 | 0 |
| 0.8402777777777778 | 0 |
| 0.8409722222222222 | 0 |
| 0.8416666666666667 | 0 |
| 0.842361111111111 | 0 |
| 0.8430555555555556 | 0 |
| 0.84375 | 0 |
| 0.8444444444444444 | 0 |
| 0.845138888888889 | 0 |
| 0.8458333333333333 | 0 |
| 0.8465277777777778 | 0 |
| 0.8472222222222222 | 0 |
| 0.8479166666666668 | 0 |
| 0.8486111111111111 | 0 |
| 0.8493055555555555 | 0 |
| 0.85 | 0 |
| 0.8506944444444445 | 0 |
| 0.8513888888888889 | 0 |
| 0.8520833333333333 | 0 |
| 0.8527777777777777 | 0 |
| 0.8534722222222223 | 0 |
| 0.8541666666666666 | 0 |
| 0.8548611111111111 | 0 |
| 0.8555555555555556 | 0 |
| 0.8562500000000001 | 0 |
| 0.8569444444444444 | 0 |
| 0.8576388888888888 | 0 |
| 0.8583333333333334 | 0 |
| 0.8590277777777778 | 0 |
| 0.8597222222222222 | 0 |
| 0.8604166666666666 | 0 |
| 0.8611111111111112 | 0 |
| 0.8618055555555556 | 0 |
| 0.8624999999999999 | 0 |
| 0.8631944444444444 | 0 |
| 0.8638888888888889 | 0 |
| 0.8645833333333334 | 0 |
| 0.8652777777777777 | 0 |
| 0.8659722222222223 | 0 |
| 0.8666666666666667 | 0 |
| 0.8673611111111111 | 0 |
| 0.8680555555555555 | 0 |
| 0.86875 | 0 |
| 0.8694444444444445 | 0 |
| 0.8701388888888889 | 0 |
| 0.8708333333333332 | 0 |
| 0.8715277777777778 | 0 |
| 0.8722222222222222 | 0 |
| 0.8729166666666667 | 0 |
| 0.873611111111111 | 0 |
| 0.8743055555555556 | 0 |
| 0.875 | 0 |
| 0.8756944444444444 | 0 |
| 0.876388888888889 | 0 |
| 0.8770833333333333 | 0 |
| 0.8777777777777778 | 0 |
| 0.8784722222222222 | 0 |
| 0.8791666666666668 | 0 |
| 0.8798611111111111 | 0 |
| 0.8805555555555555 | 0 |
| 0.88125 | 0 |
| 0.8819444444444445 | 0 |
| 0.8826388888888889 | 0 |
| 0.8833333333333333 | 0 |
| 0.8840277777777777 | 0 |
| 0.8847222222222223 | 0 |
| 0.8854166666666666 | 0 |
| 0.8861111111111111 | 0 |
| 0.8868055555555556 | 0 |
| 0.8875000000000001 | 0 |
| 0.8881944444444444 | 0 |
| 0.8888888888888888 | 0 |
| 0.8895833333333334 | 0 |
| 0.8902777777777778 | 0 |
| 0.8909722222222222 | 0 |
| 0.8916666666666666 | 0 |
| 0.8923611111111112 | 0 |
| 0.8930555555555556 | 0 |
| 0.8937499999999999 | 0 |
| 0.8944444444444444 | 0 |
| 0.8951388888888889 | 0 |
| 0.8958333333333334 | 0 |
| 0.8965277777777777 | 0 |
| 0.8972222222222223 | 0 |
| 0.8979166666666667 | 0 |
| 0.8986111111111111 | 0 |
| 0.8993055555555555 | 0 |
| 0.9 | 0 |
| 0.9006944444444445 | 0 |
| 0.9013888888888889 | 0 |
| 0.9020833333333332 | 0 |
| 0.9027777777777778 | 0 |
| 0.9034722222222222 | 0 |
| 0.9041666666666667 | 0 |
| 0.904861111111111 | 0 |
| 0.9055555555555556 | 0 |
| 0.90625 | 0 |
| 0.9069444444444444 | 0 |
| 0.907638888888889 | 0 |
| 0.9083333333333333 | 0 |
| 0.9090277777777778 | 0 |
| 0.9097222222222222 | 0 |
| 0.9104166666666668 | 0 |
| 0.9111111111111111 | 0 |
| 0.9118055555555555 | 0 |
| 0.9125 | 0 |
| 0.9131944444444445 | 0 |
| 0.9138888888888889 | 0 |
| 0.9145833333333333 | 0 |
| 0.9152777777777777 | 0 |
| 0.9159722222222223 | 0 |
| 0.9166666666666666 | 0 |
| 0.9173611111111111 | 0 |
| 0.9180555555555556 | 0 |
| 0.9187500000000001 | 0 |
| 0.9194444444444444 | 0 |
| 0.9201388888888888 | 0 |
| 0.9208333333333334 | 0 |
| 0.9215277777777778 | 0 |
| 0.9222222222222222 | 0 |
| 0.9229166666666666 | 0 |
| 0.9236111111111112 | 0 |
| 0.9243055555555556 | 0 |
| 0.9249999999999999 | 0 |
| 0.9256944444444444 | 0 |
| 0.9263888888888889 | 0 |
| 0.9270833333333334 | 0 |
| 0.9277777777777777 | 0 |
| 0.9284722222222223 | 0 |
| 0.9291666666666667 | 0 |
| 0.9298611111111111 | 0 |
| 0.9305555555555555 | 0 |
| 0.93125 | 0 |
| 0.9319444444444445 | 0 |
| 0.9326388888888889 | 0 |
| 0.9333333333333332 | 0 |
| 0.9340277777777778 | 0 |
| 0.9347222222222222 | 0 |
| 0.9354166666666667 | 0 |
| 0.936111111111111 | 0 |
| 0.9368055555555556 | 0 |
| 0.9375 | 0 |
| 0.9381944444444444 | 0 |
| 0.938888888888889 | 0 |
| 0.9395833333333333 | 0 |
| 0.9402777777777778 | 0 |
| 0.9409722222222222 | 0 |
| 0.9416666666666668 | 0 |
| 0.9423611111111111 | 0 |
| 0.9430555555555555 | 0 |
| 0.94375 | 0 |
| 0.9444444444444445 | 0 |
| 0.9451388888888889 | 0 |
| 0.9458333333333333 | 0 |
| 0.9465277777777777 | 0 |
| 0.9472222222222223 | 0 |
| 0.9479166666666666 | 0 |
| 0.9486111111111111 | 0 |
| 0.9493055555555556 | 0 |
| 0.9500000000000001 | 0 |
| 0.9506944444444444 | 0 |
| 0.9513888888888888 | 0 |
| 0.9520833333333334 | 0 |
| 0.9527777777777778 | 0 |
| 0.9534722222222222 | 0 |
| 0.9541666666666666 | 0 |
| 0.9548611111111112 | 0 |
| 0.9555555555555556 | 0 |
| 0.9562499999999999 | 0 |
| 0.9569444444444444 | 0 |
| 0.9576388888888889 | 0 |
| 0.9583333333333334 | 0 |
| 0.9590277777777777 | 0 |
| 0.9597222222222223 | 0 |
| 0.9604166666666667 | 0 |
| 0.9611111111111111 | 0 |
| 0.9618055555555555 | 0 |
| 0.9625 | 0 |
| 0.9631944444444445 | 0 |
| 0.9638888888888889 | 0 |
| 0.9645833333333332 | 0 |
| 0.9652777777777778 | 0 |
| 0.9659722222222222 | 0 |
| 0.9666666666666667 | 0 |
| 0.967361111111111 | 0 |
| 0.9680555555555556 | 0 |
| 0.96875 | 0 |
| 0.9694444444444444 | 0 |
| 0.970138888888889 | 0 |
| 0.9708333333333333 | 0 |
| 0.9715277777777778 | 0 |
| 0.9722222222222222 | 0 |
| 0.9729166666666668 | 0 |
| 0.9736111111111111 | 0 |
| 0.9743055555555555 | 0 |
| 0.975 | 0 |
| 0.9756944444444445 | 0 |
| 0.9763888888888889 | 0 |
| 0.9770833333333333 | 0 |
| 0.9777777777777777 | 0 |
| 0.9784722222222223 | 0 |
| 0.9791666666666666 | 0 |
| 0.9798611111111111 | 0 |
| 0.9805555555555556 | 0 |
| 0.9812500000000001 | 0 |
| 0.9819444444444444 | 0 |
| 0.9826388888888888 | 0 |
| 0.9833333333333334 | 0 |
| 0.9840277777777778 | 0 |
| 0.9847222222222222 | 0 |
| 0.9854166666666666 | 0 |
| 0.9861111111111112 | 0 |
| 0.9868055555555556 | 0 |
| 0.9874999999999999 | 0 |
| 0.9881944444444444 | 0 |
| 0.9888888888888889 | 0 |
| 0.9895833333333334 | 0 |
| 0.9902777777777777 | 0 |
| 0.9909722222222223 | 0 |
| 0.9916666666666667 | 0 |
| 0.9923611111111111 | 0 |
| 0.9930555555555555 | 0 |
| 0.99375 | 0 |
| 0.9944444444444445 | 0 |
| 0.9951388888888889 | 0 |
| 0.9958333333333332 | 0 |
| 0.9965277777777778 | 0 |
| 0.9972222222222222 | 0 |
| 0.9979166666666667 | 0 |
| 0.998611111111111 | 0 |
| 0.9993055555555556 | 0 |